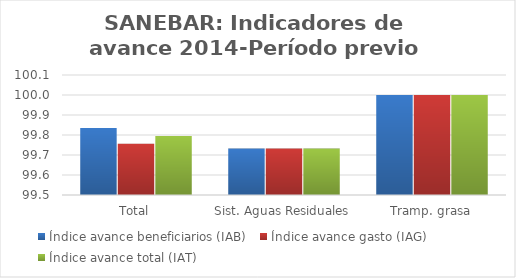
| Category | Índice avance beneficiarios (IAB)  | Índice avance gasto (IAG) | Índice avance total (IAT)  |
|---|---|---|---|
| Total | 99.835 | 99.756 | 99.796 |
| Sist. Aguas Residuales | 99.732 | 99.732 | 99.732 |
| Tramp. grasa | 100 | 100 | 100 |